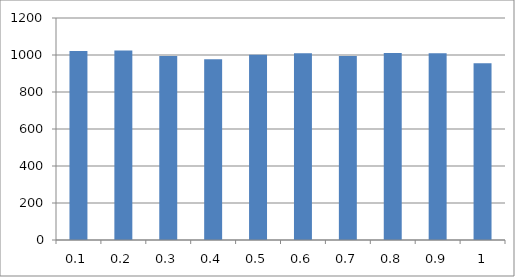
| Category | Series 0 |
|---|---|
| 0.1 | 1021 |
| 0.2 | 1025 |
| 0.3 | 994 |
| 0.4 | 977 |
| 0.5 | 1002 |
| 0.6 | 1009 |
| 0.7 | 995 |
| 0.8 | 1011 |
| 0.9 | 1010 |
| 1.0 | 956 |